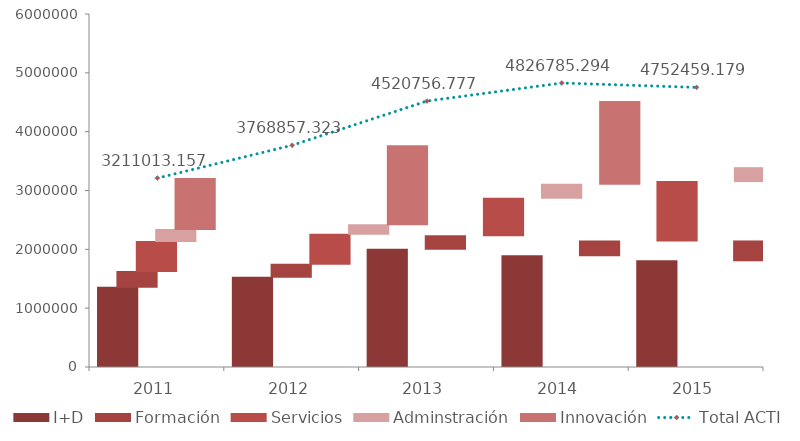
| Category | I+D | Formación | Servicios | Adminstración | Innovación |
|---|---|---|---|---|---|
| 2011.0 | 1362006.773 | 267724.158 | 513225.967 | 203460.023 | 864596.235 |
| 2012.0 | 1534283.875 | 221063.243 | 509336.217 | 162035.018 | 1342138.97 |
| 2013.0 | 2010574.233 | 228262.133 | 638182.681 | 237805.569 | 1405932.16 |
| 2014.0 | 1899032.584 | 249806.885 | 1011114.837 | 236060.605 | 1430770.383 |
| 2015.0 | 1813779.105 | 336826.307 | 1000991.587 | 147504.414 | 1453357.765 |